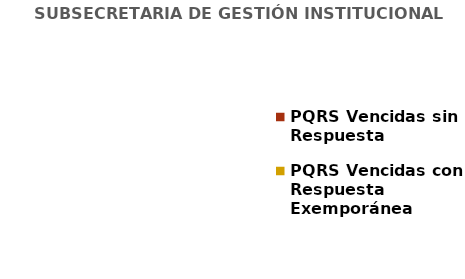
| Category | SUBSECRETARIA DE GESTIÓN INSTITUCIONAL |
|---|---|
| PQRS Vencidas sin Respuesta | 0 |
| PQRS Vencidas con Respuesta Exemporánea | 0 |